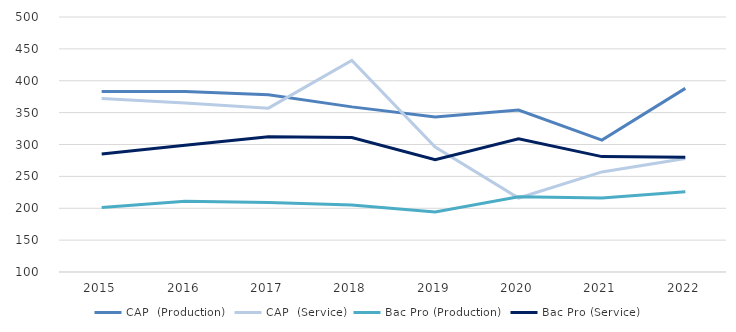
| Category | CAP  | Bac Pro |
|---|---|---|
| 2015.0 | 372 | 285 |
| 2016.0 | 365 | 299 |
| 2017.0 | 357 | 312 |
| 2018.0 | 432 | 311 |
| 2019.0 | 296 | 276 |
| 2020.0 | 216 | 309 |
| 2021.0 | 257 | 281 |
| 2022.0 | 278 | 280 |